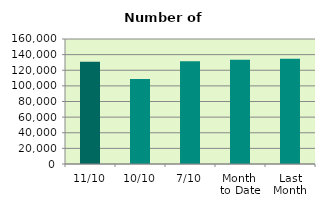
| Category | Series 0 |
|---|---|
| 11/10 | 130820 |
| 10/10 | 108914 |
| 7/10 | 131370 |
| Month 
to Date | 133417.143 |
| Last
Month | 134880 |